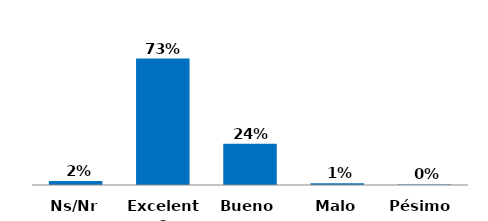
| Category | Series 0 |
|---|---|
| Pésimo  | 0.003 |
| Malo | 0.01 |
| Bueno | 0.237 |
| Excelente | 0.727 |
| Ns/Nr | 0.023 |